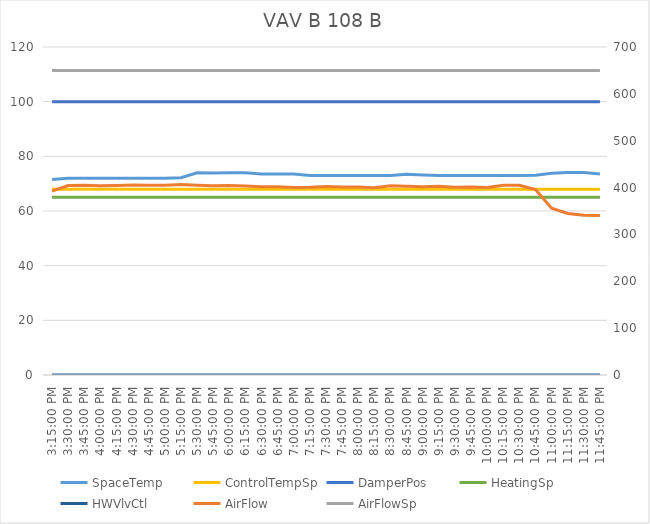
| Category | SpaceTemp | ControlTempSp | DamperPos | HeatingSp | HWVlvCtl |
|---|---|---|---|---|---|
| 2019-09-07 15:15:00 | 71.5 | 68 | 100 | 65 | 0 |
| 2019-09-07 15:30:00 | 72 | 68 | 100 | 65 | 0 |
| 2019-09-07 15:45:00 | 72 | 68 | 100 | 65 | 0 |
| 2019-09-07 16:00:00 | 72 | 68 | 100 | 65 | 0 |
| 2019-09-07 16:15:00 | 72 | 68 | 100 | 65 | 0 |
| 2019-09-07 16:30:00 | 72 | 68 | 100 | 65 | 0 |
| 2019-09-07 16:45:00 | 72 | 68 | 100 | 65 | 0 |
| 2019-09-07 17:00:00 | 72 | 68 | 100 | 65 | 0 |
| 2019-09-07 17:15:00 | 72.2 | 68 | 100 | 65 | 0 |
| 2019-09-07 17:30:00 | 74 | 68 | 100 | 65 | 0 |
| 2019-09-07 17:45:00 | 73.9 | 68 | 100 | 65 | 0 |
| 2019-09-07 18:00:00 | 74 | 68 | 100 | 65 | 0 |
| 2019-09-07 18:15:00 | 74 | 68 | 100 | 65 | 0 |
| 2019-09-07 18:30:00 | 73.5 | 68 | 100 | 65 | 0 |
| 2019-09-07 18:45:00 | 73.5 | 68 | 100 | 65 | 0 |
| 2019-09-07 19:00:00 | 73.5 | 68 | 100 | 65 | 0 |
| 2019-09-07 19:15:00 | 73 | 68 | 100 | 65 | 0 |
| 2019-09-07 19:30:00 | 73 | 68 | 100 | 65 | 0 |
| 2019-09-07 19:45:00 | 73 | 68 | 100 | 65 | 0 |
| 2019-09-07 20:00:00 | 73 | 68 | 100 | 65 | 0 |
| 2019-09-07 20:15:00 | 73 | 68 | 100 | 65 | 0 |
| 2019-09-07 20:30:00 | 73 | 68 | 100 | 65 | 0 |
| 2019-09-07 20:45:00 | 73.4 | 68 | 100 | 65 | 0 |
| 2019-09-07 21:00:00 | 73.2 | 68 | 100 | 65 | 0 |
| 2019-09-07 21:15:00 | 73 | 68 | 100 | 65 | 0 |
| 2019-09-07 21:30:00 | 73 | 68 | 100 | 65 | 0 |
| 2019-09-07 21:45:00 | 73 | 68 | 100 | 65 | 0 |
| 2019-09-07 22:00:00 | 73 | 68 | 100 | 65 | 0 |
| 2019-09-07 22:15:00 | 73 | 68 | 100 | 65 | 0 |
| 2019-09-07 22:30:00 | 73 | 68 | 100 | 65 | 0 |
| 2019-09-07 22:45:00 | 73.1 | 68 | 100 | 65 | 0 |
| 2019-09-07 23:00:00 | 73.8 | 68 | 100 | 65 | 0 |
| 2019-09-07 23:15:00 | 74.1 | 68 | 100 | 65 | 0 |
| 2019-09-07 23:30:00 | 74.1 | 68 | 100 | 65 | 0 |
| 2019-09-07 23:45:00 | 73.5 | 68 | 100 | 65 | 0 |